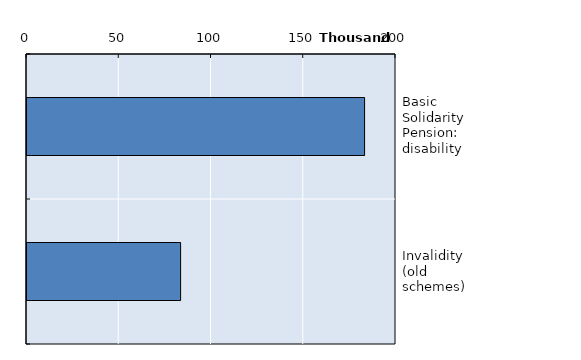
| Category | Series 0 |
|---|---|
| Basic Solidarity Pension: disability | 182976.417 |
| Invalidity (old schemes) | 83250.5 |